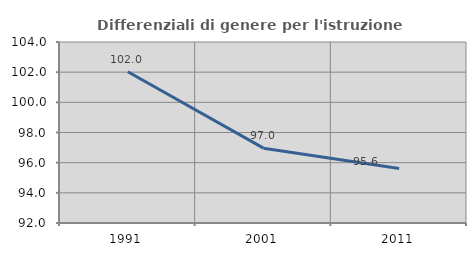
| Category | Differenziali di genere per l'istruzione superiore |
|---|---|
| 1991.0 | 102.025 |
| 2001.0 | 96.961 |
| 2011.0 | 95.612 |